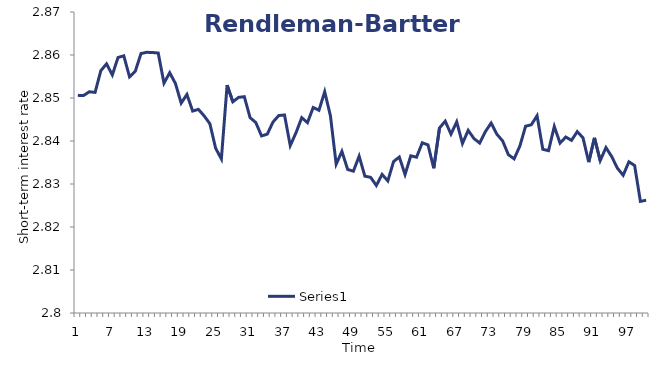
| Category | Series 0 |
|---|---|
| 0 | 2.851 |
| 1 | 2.851 |
| 2 | 2.851 |
| 3 | 2.851 |
| 4 | 2.856 |
| 5 | 2.858 |
| 6 | 2.855 |
| 7 | 2.859 |
| 8 | 2.86 |
| 9 | 2.855 |
| 10 | 2.856 |
| 11 | 2.86 |
| 12 | 2.861 |
| 13 | 2.861 |
| 14 | 2.86 |
| 15 | 2.853 |
| 16 | 2.856 |
| 17 | 2.853 |
| 18 | 2.849 |
| 19 | 2.851 |
| 20 | 2.847 |
| 21 | 2.847 |
| 22 | 2.846 |
| 23 | 2.844 |
| 24 | 2.838 |
| 25 | 2.836 |
| 26 | 2.853 |
| 27 | 2.849 |
| 28 | 2.85 |
| 29 | 2.85 |
| 30 | 2.845 |
| 31 | 2.844 |
| 32 | 2.841 |
| 33 | 2.842 |
| 34 | 2.844 |
| 35 | 2.846 |
| 36 | 2.846 |
| 37 | 2.839 |
| 38 | 2.842 |
| 39 | 2.845 |
| 40 | 2.844 |
| 41 | 2.848 |
| 42 | 2.847 |
| 43 | 2.851 |
| 44 | 2.846 |
| 45 | 2.835 |
| 46 | 2.838 |
| 47 | 2.833 |
| 48 | 2.833 |
| 49 | 2.836 |
| 50 | 2.832 |
| 51 | 2.832 |
| 52 | 2.83 |
| 53 | 2.832 |
| 54 | 2.831 |
| 55 | 2.835 |
| 56 | 2.836 |
| 57 | 2.832 |
| 58 | 2.837 |
| 59 | 2.836 |
| 60 | 2.84 |
| 61 | 2.839 |
| 62 | 2.834 |
| 63 | 2.843 |
| 64 | 2.845 |
| 65 | 2.842 |
| 66 | 2.844 |
| 67 | 2.839 |
| 68 | 2.842 |
| 69 | 2.841 |
| 70 | 2.84 |
| 71 | 2.842 |
| 72 | 2.844 |
| 73 | 2.842 |
| 74 | 2.84 |
| 75 | 2.837 |
| 76 | 2.836 |
| 77 | 2.839 |
| 78 | 2.843 |
| 79 | 2.844 |
| 80 | 2.846 |
| 81 | 2.838 |
| 82 | 2.838 |
| 83 | 2.843 |
| 84 | 2.84 |
| 85 | 2.841 |
| 86 | 2.84 |
| 87 | 2.842 |
| 88 | 2.841 |
| 89 | 2.835 |
| 90 | 2.841 |
| 91 | 2.835 |
| 92 | 2.838 |
| 93 | 2.836 |
| 94 | 2.834 |
| 95 | 2.832 |
| 96 | 2.835 |
| 97 | 2.834 |
| 98 | 2.826 |
| 99 | 2.826 |